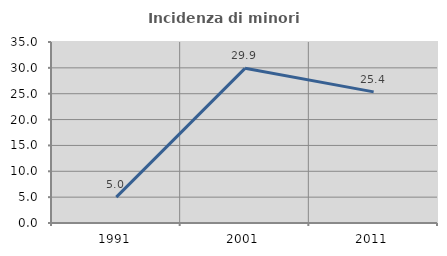
| Category | Incidenza di minori stranieri |
|---|---|
| 1991.0 | 5 |
| 2001.0 | 29.907 |
| 2011.0 | 25.357 |